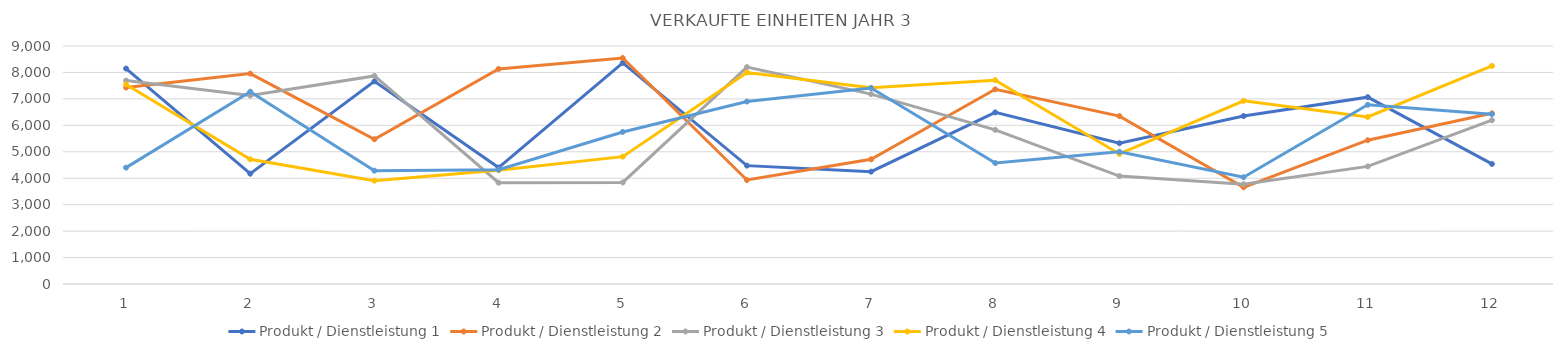
| Category | Produkt / Dienstleistung 1 | Produkt / Dienstleistung 2 | Produkt / Dienstleistung 3 | Produkt / Dienstleistung 4 | Produkt / Dienstleistung 5 |
|---|---|---|---|---|---|
| 0 | 8146 | 7430 | 7694 | 7544 | 4401 |
| 1 | 4171 | 7956 | 7127 | 4716 | 7273 |
| 2 | 7662 | 5475 | 7868 | 3907 | 4286 |
| 3 | 4404 | 8133 | 3831 | 4302 | 4322 |
| 4 | 8362 | 8546 | 3840 | 4816 | 5750 |
| 5 | 4476 | 3933 | 8201 | 7998 | 6900 |
| 6 | 4247 | 4715 | 7181 | 7419 | 7411 |
| 7 | 6489 | 7362 | 5828 | 7707 | 4573 |
| 8 | 5323 | 6348 | 4082 | 4919 | 4999 |
| 9 | 6351 | 3656 | 3773 | 6927 | 4036 |
| 10 | 7065 | 5437 | 4447 | 6317 | 6777 |
| 11 | 4540 | 6454 | 6195 | 8245 | 6421 |